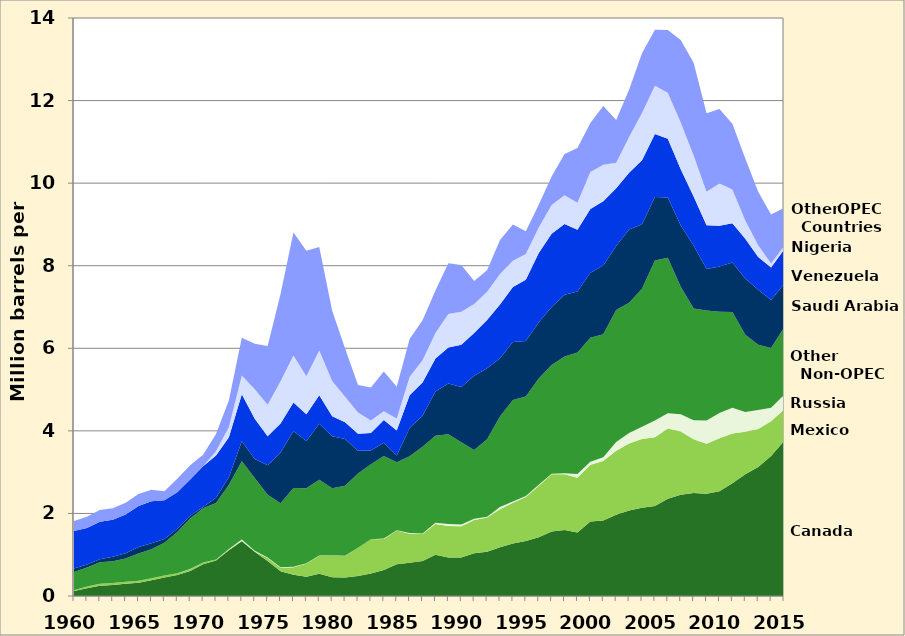
| Category | Canada | Mexico | Russia | Other Non-OPEC | Saudi Arabia | Venezuela | Nigeria | Other OPEC Countries |
|---|---|---|---|---|---|---|---|---|
| 1960.0 | 0.12 | 0.016 | 0 | 0.445 | 0.084 | 0.911 | 0 | 0.238 |
| 1961.0 | 0.19 | 0.04 | 0 | 0.463 | 0.073 | 0.879 | 0 | 0.272 |
| 1962.0 | 0.25 | 0.049 | 0 | 0.517 | 0.074 | 0.906 | 0 | 0.286 |
| 1963.0 | 0.265 | 0.048 | 0 | 0.527 | 0.108 | 0.9 | 0 | 0.274 |
| 1964.0 | 0.299 | 0.047 | 0 | 0.561 | 0.131 | 0.933 | 0 | 0.287 |
| 1965.0 | 0.323 | 0.048 | 0 | 0.658 | 0.158 | 0.994 | 0 | 0.286 |
| 1966.0 | 0.384 | 0.045 | 0 | 0.7 | 0.147 | 1.018 | 0 | 0.279 |
| 1967.0 | 0.45 | 0.049 | 0 | 0.791 | 0.092 | 0.938 | 0 | 0.218 |
| 1968.0 | 0.506 | 0.045 | 0 | 1.001 | 0.074 | 0.886 | 0 | 0.326 |
| 1969.0 | 0.608 | 0.043 | 0.002 | 1.227 | 0.065 | 0.875 | 0 | 0.346 |
| 1970.0 | 0.766 | 0.042 | 0.003 | 1.314 | 0.03 | 0.989 | 0 | 0.275 |
| 1971.0 | 0.857 | 0.027 | 0 | 1.368 | 0.128 | 1.02 | 0.102 | 0.422 |
| 1972.0 | 1.108 | 0.021 | 0.008 | 1.557 | 0.19 | 0.959 | 0.251 | 0.646 |
| 1973.0 | 1.325 | 0.016 | 0.026 | 1.897 | 0.486 | 1.135 | 0.459 | 0.913 |
| 1974.0 | 1.07 | 0.008 | 0.02 | 1.758 | 0.461 | 0.979 | 0.713 | 1.103 |
| 1975.0 | 0.846 | 0.071 | 0.014 | 1.522 | 0.715 | 0.702 | 0.762 | 1.422 |
| 1976.0 | 0.599 | 0.087 | 0.011 | 1.55 | 1.23 | 0.7 | 1.025 | 2.111 |
| 1977.0 | 0.517 | 0.179 | 0.012 | 1.906 | 1.38 | 0.69 | 1.143 | 2.979 |
| 1978.0 | 0.467 | 0.318 | 0.008 | 1.819 | 1.144 | 0.646 | 0.919 | 3.043 |
| 1979.0 | 0.538 | 0.439 | 0.001 | 1.841 | 1.356 | 0.69 | 1.08 | 2.511 |
| 1980.0 | 0.455 | 0.533 | 0.001 | 1.621 | 1.261 | 0.481 | 0.857 | 1.701 |
| 1981.0 | 0.447 | 0.522 | 0.005 | 1.698 | 1.129 | 0.406 | 0.62 | 1.168 |
| 1982.0 | 0.482 | 0.685 | 0.001 | 1.8 | 0.552 | 0.412 | 0.514 | 0.668 |
| 1983.0 | 0.547 | 0.826 | 0.001 | 1.814 | 0.337 | 0.422 | 0.302 | 0.801 |
| 1984.0 | 0.63 | 0.748 | 0.013 | 1.997 | 0.325 | 0.548 | 0.216 | 0.96 |
| 1985.0 | 0.77 | 0.816 | 0.008 | 1.643 | 0.168 | 0.605 | 0.293 | 0.765 |
| 1986.0 | 0.807 | 0.699 | 0.018 | 1.863 | 0.685 | 0.793 | 0.44 | 0.918 |
| 1987.0 | 0.848 | 0.655 | 0.011 | 2.104 | 0.751 | 0.804 | 0.535 | 0.97 |
| 1988.0 | 0.999 | 0.747 | 0.029 | 2.107 | 1.073 | 0.794 | 0.618 | 1.034 |
| 1989.0 | 0.931 | 0.767 | 0.048 | 2.175 | 1.224 | 0.873 | 0.815 | 1.228 |
| 1990.0 | 0.934 | 0.755 | 0.045 | 1.988 | 1.339 | 1.025 | 0.8 | 1.132 |
| 1991.0 | 1.033 | 0.807 | 0.029 | 1.666 | 1.802 | 1.035 | 0.703 | 0.553 |
| 1992.0 | 1.069 | 0.83 | 0.018 | 1.879 | 1.72 | 1.17 | 0.681 | 0.521 |
| 1993.0 | 1.181 | 0.919 | 0.055 | 2.192 | 1.414 | 1.3 | 0.74 | 0.82 |
| 1994.0 | 1.272 | 0.984 | 0.03 | 2.463 | 1.402 | 1.334 | 0.637 | 0.873 |
| 1995.0 | 1.332 | 1.068 | 0.025 | 2.409 | 1.344 | 1.48 | 0.627 | 0.55 |
| 1996.0 | 1.424 | 1.244 | 0.025 | 2.574 | 1.363 | 1.676 | 0.617 | 0.555 |
| 1997.0 | 1.563 | 1.385 | 0.013 | 2.632 | 1.407 | 1.773 | 0.698 | 0.691 |
| 1998.0 | 1.598 | 1.351 | 0.024 | 2.829 | 1.491 | 1.719 | 0.696 | 0.999 |
| 1999.0 | 1.539 | 1.324 | 0.089 | 2.946 | 1.478 | 1.493 | 0.657 | 1.325 |
| 2000.0 | 1.807 | 1.373 | 0.072 | 3.005 | 1.572 | 1.546 | 0.896 | 1.188 |
| 2001.0 | 1.828 | 1.44 | 0.09 | 2.985 | 1.662 | 1.553 | 0.885 | 1.428 |
| 2002.0 | 1.971 | 1.547 | 0.21 | 3.198 | 1.552 | 1.398 | 0.621 | 1.034 |
| 2003.0 | 2.072 | 1.623 | 0.254 | 3.153 | 1.774 | 1.376 | 0.867 | 1.144 |
| 2004.0 | 2.138 | 1.665 | 0.298 | 3.343 | 1.558 | 1.554 | 1.14 | 1.449 |
| 2005.0 | 2.181 | 1.662 | 0.41 | 3.873 | 1.537 | 1.529 | 1.166 | 1.356 |
| 2006.0 | 2.353 | 1.705 | 0.369 | 3.763 | 1.463 | 1.419 | 1.114 | 1.52 |
| 2007.0 | 2.455 | 1.532 | 0.414 | 3.088 | 1.485 | 1.361 | 1.134 | 2 |
| 2008.0 | 2.493 | 1.302 | 0.465 | 2.702 | 1.529 | 1.189 | 0.988 | 2.248 |
| 2009.0 | 2.479 | 1.21 | 0.563 | 2.663 | 1.004 | 1.063 | 0.809 | 1.9 |
| 2010.0 | 2.535 | 1.284 | 0.612 | 2.455 | 1.096 | 0.988 | 1.023 | 1.8 |
| 2011.0 | 2.729 | 1.206 | 0.624 | 2.322 | 1.195 | 0.951 | 0.818 | 1.592 |
| 2012.0 | 2.946 | 1.035 | 0.477 | 1.868 | 1.365 | 0.96 | 0.441 | 1.505 |
| 2013.0 | 3.125 | 0.919 | 0.459 | 1.585 | 1.328 | 0.797 | 0.281 | 1.3 |
| 2014.0 | 3.388 | 0.842 | 0.33 | 1.444 | 1.166 | 0.789 | 0.092 | 1.19 |
| 2015.0 | 3.754 | 0.758 | 0.354 | 1.635 | 1.058 | 0.83 | 0.083 | 0.928 |